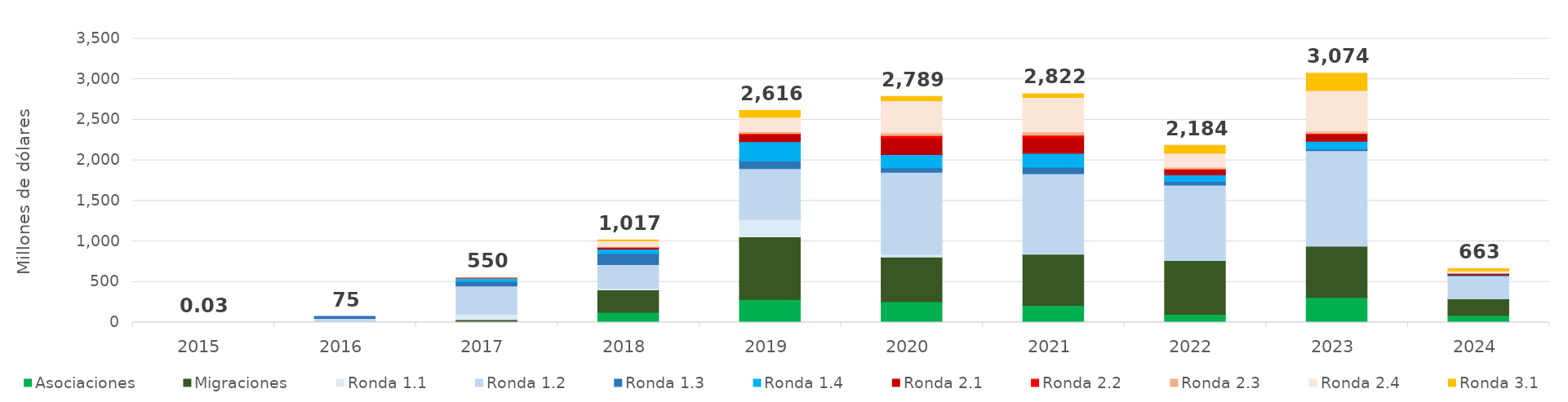
| Category | Asociaciones | Migraciones | Ronda 1.1 | Ronda 1.2 | Ronda 1.3 | Ronda 1.4 | Ronda 2.1 | Ronda 2.2 | Ronda 2.3 | Ronda 2.4 | Ronda 3.1 |
|---|---|---|---|---|---|---|---|---|---|---|---|
| 2015.0 | 0 | 0 | 0.023 | 0.003 | 0 | 0 | 0 | 0 | 0 | 0 | 0 |
| 2016.0 | 0 | 0 | 7.936 | 41.333 | 25.282 | 0 | 0 | 0 | 0 | 0 | 0 |
| 2017.0 | 2.542 | 33.018 | 63.397 | 349.863 | 56.94 | 42.788 | 0.983 | 0.059 | 0.096 | 0 | 0 |
| 2018.0 | 125.867 | 276.816 | 16.108 | 294.863 | 135.1 | 55.228 | 21.392 | 2.843 | 10.748 | 66.3 | 11.883 |
| 2019.0 | 283.572 | 772.876 | 213.402 | 628.348 | 92.772 | 239.73 | 87.584 | 13.102 | 21.34 | 178.948 | 83.95 |
| 2020.0 | 257.541 | 550.523 | 34.013 | 1011.433 | 55.889 | 161.565 | 200.141 | 33.971 | 33.561 | 396.842 | 53.073 |
| 2021.0 | 210.348 | 631.613 | 8.662 | 983.846 | 81.954 | 170.902 | 191.437 | 32.428 | 39.079 | 425.153 | 46.21 |
| 2022.0 | 100.478 | 664.135 | 0.096 | 930.188 | 44.312 | 81.891 | 69.333 | 2.33 | 24.094 | 170.079 | 97.522 |
| 2023.0 | 309.546 | 630.228 | 0 | 1179.242 | 20.961 | 95.246 | 95.213 | 1.179 | 25.955 | 503.583 | 212.89 |
| 2024.0 | 87.055 | 204.548 | 0 | 281.725 | 2.049 | 10.571 | 19.973 | 0.699 | 3.909 | 24.874 | 27.393 |